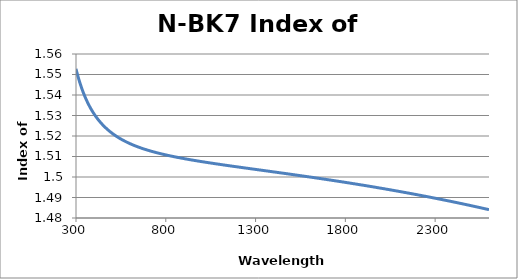
| Category | N-BK7 Index of Refraction |
|---|---|
| 300.0 | 1.553 |
| 301.0 | 1.552 |
| 302.0 | 1.552 |
| 303.0 | 1.552 |
| 304.0 | 1.551 |
| 305.0 | 1.551 |
| 306.0 | 1.551 |
| 307.0 | 1.55 |
| 308.0 | 1.55 |
| 309.0 | 1.55 |
| 310.0 | 1.549 |
| 311.0 | 1.549 |
| 312.0 | 1.549 |
| 313.0 | 1.548 |
| 314.0 | 1.548 |
| 315.0 | 1.548 |
| 316.0 | 1.548 |
| 317.0 | 1.547 |
| 318.0 | 1.547 |
| 319.0 | 1.547 |
| 320.0 | 1.546 |
| 321.0 | 1.546 |
| 322.0 | 1.546 |
| 323.0 | 1.546 |
| 324.0 | 1.545 |
| 325.0 | 1.545 |
| 326.0 | 1.545 |
| 327.0 | 1.545 |
| 328.0 | 1.544 |
| 329.0 | 1.544 |
| 330.0 | 1.544 |
| 331.0 | 1.543 |
| 332.0 | 1.543 |
| 333.0 | 1.543 |
| 334.0 | 1.543 |
| 335.0 | 1.543 |
| 336.0 | 1.542 |
| 337.0 | 1.542 |
| 338.0 | 1.542 |
| 339.0 | 1.542 |
| 340.0 | 1.541 |
| 341.0 | 1.541 |
| 342.0 | 1.541 |
| 343.0 | 1.541 |
| 344.0 | 1.54 |
| 345.0 | 1.54 |
| 346.0 | 1.54 |
| 347.0 | 1.54 |
| 348.0 | 1.54 |
| 349.0 | 1.539 |
| 350.0 | 1.539 |
| 351.0 | 1.539 |
| 352.0 | 1.539 |
| 353.0 | 1.539 |
| 354.0 | 1.538 |
| 355.0 | 1.538 |
| 356.0 | 1.538 |
| 357.0 | 1.538 |
| 358.0 | 1.538 |
| 359.0 | 1.537 |
| 360.0 | 1.537 |
| 361.0 | 1.537 |
| 362.0 | 1.537 |
| 363.0 | 1.537 |
| 364.0 | 1.536 |
| 365.0 | 1.536 |
| 366.0 | 1.536 |
| 367.0 | 1.536 |
| 368.0 | 1.536 |
| 369.0 | 1.536 |
| 370.0 | 1.535 |
| 371.0 | 1.535 |
| 372.0 | 1.535 |
| 373.0 | 1.535 |
| 374.0 | 1.535 |
| 375.0 | 1.535 |
| 376.0 | 1.534 |
| 377.0 | 1.534 |
| 378.0 | 1.534 |
| 379.0 | 1.534 |
| 380.0 | 1.534 |
| 381.0 | 1.534 |
| 382.0 | 1.533 |
| 383.0 | 1.533 |
| 384.0 | 1.533 |
| 385.0 | 1.533 |
| 386.0 | 1.533 |
| 387.0 | 1.533 |
| 388.0 | 1.533 |
| 389.0 | 1.532 |
| 390.0 | 1.532 |
| 391.0 | 1.532 |
| 392.0 | 1.532 |
| 393.0 | 1.532 |
| 394.0 | 1.532 |
| 395.0 | 1.532 |
| 396.0 | 1.531 |
| 397.0 | 1.531 |
| 398.0 | 1.531 |
| 399.0 | 1.531 |
| 400.0 | 1.531 |
| 401.0 | 1.531 |
| 402.0 | 1.531 |
| 403.0 | 1.53 |
| 404.0 | 1.53 |
| 405.0 | 1.53 |
| 406.0 | 1.53 |
| 407.0 | 1.53 |
| 408.0 | 1.53 |
| 409.0 | 1.53 |
| 410.0 | 1.53 |
| 411.0 | 1.529 |
| 412.0 | 1.529 |
| 413.0 | 1.529 |
| 414.0 | 1.529 |
| 415.0 | 1.529 |
| 416.0 | 1.529 |
| 417.0 | 1.529 |
| 418.0 | 1.529 |
| 419.0 | 1.528 |
| 420.0 | 1.528 |
| 421.0 | 1.528 |
| 422.0 | 1.528 |
| 423.0 | 1.528 |
| 424.0 | 1.528 |
| 425.0 | 1.528 |
| 426.0 | 1.528 |
| 427.0 | 1.528 |
| 428.0 | 1.528 |
| 429.0 | 1.527 |
| 430.0 | 1.527 |
| 431.0 | 1.527 |
| 432.0 | 1.527 |
| 433.0 | 1.527 |
| 434.0 | 1.527 |
| 435.0 | 1.527 |
| 436.0 | 1.527 |
| 437.0 | 1.527 |
| 438.0 | 1.526 |
| 439.0 | 1.526 |
| 440.0 | 1.526 |
| 441.0 | 1.526 |
| 442.0 | 1.526 |
| 443.0 | 1.526 |
| 444.0 | 1.526 |
| 445.0 | 1.526 |
| 446.0 | 1.526 |
| 447.0 | 1.526 |
| 448.0 | 1.526 |
| 449.0 | 1.525 |
| 450.0 | 1.525 |
| 451.0 | 1.525 |
| 452.0 | 1.525 |
| 453.0 | 1.525 |
| 454.0 | 1.525 |
| 455.0 | 1.525 |
| 456.0 | 1.525 |
| 457.0 | 1.525 |
| 458.0 | 1.525 |
| 459.0 | 1.525 |
| 460.0 | 1.524 |
| 461.0 | 1.524 |
| 462.0 | 1.524 |
| 463.0 | 1.524 |
| 464.0 | 1.524 |
| 465.0 | 1.524 |
| 466.0 | 1.524 |
| 467.0 | 1.524 |
| 468.0 | 1.524 |
| 469.0 | 1.524 |
| 470.0 | 1.524 |
| 471.0 | 1.524 |
| 472.0 | 1.523 |
| 473.0 | 1.523 |
| 474.0 | 1.523 |
| 475.0 | 1.523 |
| 476.0 | 1.523 |
| 477.0 | 1.523 |
| 478.0 | 1.523 |
| 479.0 | 1.523 |
| 480.0 | 1.523 |
| 481.0 | 1.523 |
| 482.0 | 1.523 |
| 483.0 | 1.523 |
| 484.0 | 1.523 |
| 485.0 | 1.522 |
| 486.0 | 1.522 |
| 487.0 | 1.522 |
| 488.0 | 1.522 |
| 489.0 | 1.522 |
| 490.0 | 1.522 |
| 491.0 | 1.522 |
| 492.0 | 1.522 |
| 493.0 | 1.522 |
| 494.0 | 1.522 |
| 495.0 | 1.522 |
| 496.0 | 1.522 |
| 497.0 | 1.522 |
| 498.0 | 1.522 |
| 499.0 | 1.521 |
| 500.0 | 1.521 |
| 501.0 | 1.521 |
| 502.0 | 1.521 |
| 503.0 | 1.521 |
| 504.0 | 1.521 |
| 505.0 | 1.521 |
| 506.0 | 1.521 |
| 507.0 | 1.521 |
| 508.0 | 1.521 |
| 509.0 | 1.521 |
| 510.0 | 1.521 |
| 511.0 | 1.521 |
| 512.0 | 1.521 |
| 513.0 | 1.521 |
| 514.0 | 1.521 |
| 515.0 | 1.52 |
| 516.0 | 1.52 |
| 517.0 | 1.52 |
| 518.0 | 1.52 |
| 519.0 | 1.52 |
| 520.0 | 1.52 |
| 521.0 | 1.52 |
| 522.0 | 1.52 |
| 523.0 | 1.52 |
| 524.0 | 1.52 |
| 525.0 | 1.52 |
| 526.0 | 1.52 |
| 527.0 | 1.52 |
| 528.0 | 1.52 |
| 529.0 | 1.52 |
| 530.0 | 1.52 |
| 531.0 | 1.52 |
| 532.0 | 1.519 |
| 533.0 | 1.519 |
| 534.0 | 1.519 |
| 535.0 | 1.519 |
| 536.0 | 1.519 |
| 537.0 | 1.519 |
| 538.0 | 1.519 |
| 539.0 | 1.519 |
| 540.0 | 1.519 |
| 541.0 | 1.519 |
| 542.0 | 1.519 |
| 543.0 | 1.519 |
| 544.0 | 1.519 |
| 545.0 | 1.519 |
| 546.0 | 1.519 |
| 547.0 | 1.519 |
| 548.0 | 1.519 |
| 549.0 | 1.519 |
| 550.0 | 1.519 |
| 551.0 | 1.518 |
| 552.0 | 1.518 |
| 553.0 | 1.518 |
| 554.0 | 1.518 |
| 555.0 | 1.518 |
| 556.0 | 1.518 |
| 557.0 | 1.518 |
| 558.0 | 1.518 |
| 559.0 | 1.518 |
| 560.0 | 1.518 |
| 561.0 | 1.518 |
| 562.0 | 1.518 |
| 563.0 | 1.518 |
| 564.0 | 1.518 |
| 565.0 | 1.518 |
| 566.0 | 1.518 |
| 567.0 | 1.518 |
| 568.0 | 1.518 |
| 569.0 | 1.518 |
| 570.0 | 1.518 |
| 571.0 | 1.518 |
| 572.0 | 1.517 |
| 573.0 | 1.517 |
| 574.0 | 1.517 |
| 575.0 | 1.517 |
| 576.0 | 1.517 |
| 577.0 | 1.517 |
| 578.0 | 1.517 |
| 579.0 | 1.517 |
| 580.0 | 1.517 |
| 581.0 | 1.517 |
| 582.0 | 1.517 |
| 583.0 | 1.517 |
| 584.0 | 1.517 |
| 585.0 | 1.517 |
| 586.0 | 1.517 |
| 587.0 | 1.517 |
| 588.0 | 1.517 |
| 589.0 | 1.517 |
| 590.0 | 1.517 |
| 591.0 | 1.517 |
| 592.0 | 1.517 |
| 593.0 | 1.517 |
| 594.0 | 1.517 |
| 595.0 | 1.516 |
| 596.0 | 1.516 |
| 597.0 | 1.516 |
| 598.0 | 1.516 |
| 599.0 | 1.516 |
| 600.0 | 1.516 |
| 601.0 | 1.516 |
| 602.0 | 1.516 |
| 603.0 | 1.516 |
| 604.0 | 1.516 |
| 605.0 | 1.516 |
| 606.0 | 1.516 |
| 607.0 | 1.516 |
| 608.0 | 1.516 |
| 609.0 | 1.516 |
| 610.0 | 1.516 |
| 611.0 | 1.516 |
| 612.0 | 1.516 |
| 613.0 | 1.516 |
| 614.0 | 1.516 |
| 615.0 | 1.516 |
| 616.0 | 1.516 |
| 617.0 | 1.516 |
| 618.0 | 1.516 |
| 619.0 | 1.516 |
| 620.0 | 1.516 |
| 621.0 | 1.516 |
| 622.0 | 1.515 |
| 623.0 | 1.515 |
| 624.0 | 1.515 |
| 625.0 | 1.515 |
| 626.0 | 1.515 |
| 627.0 | 1.515 |
| 628.0 | 1.515 |
| 629.0 | 1.515 |
| 630.0 | 1.515 |
| 631.0 | 1.515 |
| 632.0 | 1.515 |
| 633.0 | 1.515 |
| 634.0 | 1.515 |
| 635.0 | 1.515 |
| 636.0 | 1.515 |
| 637.0 | 1.515 |
| 638.0 | 1.515 |
| 639.0 | 1.515 |
| 640.0 | 1.515 |
| 641.0 | 1.515 |
| 642.0 | 1.515 |
| 643.0 | 1.515 |
| 644.0 | 1.515 |
| 645.0 | 1.515 |
| 646.0 | 1.515 |
| 647.0 | 1.515 |
| 648.0 | 1.515 |
| 649.0 | 1.515 |
| 650.0 | 1.515 |
| 651.0 | 1.514 |
| 652.0 | 1.514 |
| 653.0 | 1.514 |
| 654.0 | 1.514 |
| 655.0 | 1.514 |
| 656.0 | 1.514 |
| 657.0 | 1.514 |
| 658.0 | 1.514 |
| 659.0 | 1.514 |
| 660.0 | 1.514 |
| 661.0 | 1.514 |
| 662.0 | 1.514 |
| 663.0 | 1.514 |
| 664.0 | 1.514 |
| 665.0 | 1.514 |
| 666.0 | 1.514 |
| 667.0 | 1.514 |
| 668.0 | 1.514 |
| 669.0 | 1.514 |
| 670.0 | 1.514 |
| 671.0 | 1.514 |
| 672.0 | 1.514 |
| 673.0 | 1.514 |
| 674.0 | 1.514 |
| 675.0 | 1.514 |
| 676.0 | 1.514 |
| 677.0 | 1.514 |
| 678.0 | 1.514 |
| 679.0 | 1.514 |
| 680.0 | 1.514 |
| 681.0 | 1.514 |
| 682.0 | 1.514 |
| 683.0 | 1.514 |
| 684.0 | 1.514 |
| 685.0 | 1.513 |
| 686.0 | 1.513 |
| 687.0 | 1.513 |
| 688.0 | 1.513 |
| 689.0 | 1.513 |
| 690.0 | 1.513 |
| 691.0 | 1.513 |
| 692.0 | 1.513 |
| 693.0 | 1.513 |
| 694.0 | 1.513 |
| 695.0 | 1.513 |
| 696.0 | 1.513 |
| 697.0 | 1.513 |
| 698.0 | 1.513 |
| 699.0 | 1.513 |
| 700.0 | 1.513 |
| 701.0 | 1.513 |
| 702.0 | 1.513 |
| 703.0 | 1.513 |
| 704.0 | 1.513 |
| 705.0 | 1.513 |
| 706.0 | 1.513 |
| 707.0 | 1.513 |
| 708.0 | 1.513 |
| 709.0 | 1.513 |
| 710.0 | 1.513 |
| 711.0 | 1.513 |
| 712.0 | 1.513 |
| 713.0 | 1.513 |
| 714.0 | 1.513 |
| 715.0 | 1.513 |
| 716.0 | 1.513 |
| 717.0 | 1.513 |
| 718.0 | 1.513 |
| 719.0 | 1.513 |
| 720.0 | 1.513 |
| 721.0 | 1.513 |
| 722.0 | 1.512 |
| 723.0 | 1.512 |
| 724.0 | 1.512 |
| 725.0 | 1.512 |
| 726.0 | 1.512 |
| 727.0 | 1.512 |
| 728.0 | 1.512 |
| 729.0 | 1.512 |
| 730.0 | 1.512 |
| 731.0 | 1.512 |
| 732.0 | 1.512 |
| 733.0 | 1.512 |
| 734.0 | 1.512 |
| 735.0 | 1.512 |
| 736.0 | 1.512 |
| 737.0 | 1.512 |
| 738.0 | 1.512 |
| 739.0 | 1.512 |
| 740.0 | 1.512 |
| 741.0 | 1.512 |
| 742.0 | 1.512 |
| 743.0 | 1.512 |
| 744.0 | 1.512 |
| 745.0 | 1.512 |
| 746.0 | 1.512 |
| 747.0 | 1.512 |
| 748.0 | 1.512 |
| 749.0 | 1.512 |
| 750.0 | 1.512 |
| 751.0 | 1.512 |
| 752.0 | 1.512 |
| 753.0 | 1.512 |
| 754.0 | 1.512 |
| 755.0 | 1.512 |
| 756.0 | 1.512 |
| 757.0 | 1.512 |
| 758.0 | 1.512 |
| 759.0 | 1.512 |
| 760.0 | 1.512 |
| 761.0 | 1.512 |
| 762.0 | 1.512 |
| 763.0 | 1.512 |
| 764.0 | 1.512 |
| 765.0 | 1.512 |
| 766.0 | 1.511 |
| 767.0 | 1.511 |
| 768.0 | 1.511 |
| 769.0 | 1.511 |
| 770.0 | 1.511 |
| 771.0 | 1.511 |
| 772.0 | 1.511 |
| 773.0 | 1.511 |
| 774.0 | 1.511 |
| 775.0 | 1.511 |
| 776.0 | 1.511 |
| 777.0 | 1.511 |
| 778.0 | 1.511 |
| 779.0 | 1.511 |
| 780.0 | 1.511 |
| 781.0 | 1.511 |
| 782.0 | 1.511 |
| 783.0 | 1.511 |
| 784.0 | 1.511 |
| 785.0 | 1.511 |
| 786.0 | 1.511 |
| 787.0 | 1.511 |
| 788.0 | 1.511 |
| 789.0 | 1.511 |
| 790.0 | 1.511 |
| 791.0 | 1.511 |
| 792.0 | 1.511 |
| 793.0 | 1.511 |
| 794.0 | 1.511 |
| 795.0 | 1.511 |
| 796.0 | 1.511 |
| 797.0 | 1.511 |
| 798.0 | 1.511 |
| 799.0 | 1.511 |
| 800.0 | 1.511 |
| 801.0 | 1.511 |
| 802.0 | 1.511 |
| 803.0 | 1.511 |
| 804.0 | 1.511 |
| 805.0 | 1.511 |
| 806.0 | 1.511 |
| 807.0 | 1.511 |
| 808.0 | 1.511 |
| 809.0 | 1.511 |
| 810.0 | 1.511 |
| 811.0 | 1.511 |
| 812.0 | 1.511 |
| 813.0 | 1.511 |
| 814.0 | 1.511 |
| 815.0 | 1.51 |
| 816.0 | 1.51 |
| 817.0 | 1.51 |
| 818.0 | 1.51 |
| 819.0 | 1.51 |
| 820.0 | 1.51 |
| 821.0 | 1.51 |
| 822.0 | 1.51 |
| 823.0 | 1.51 |
| 824.0 | 1.51 |
| 825.0 | 1.51 |
| 826.0 | 1.51 |
| 827.0 | 1.51 |
| 828.0 | 1.51 |
| 829.0 | 1.51 |
| 830.0 | 1.51 |
| 831.0 | 1.51 |
| 832.0 | 1.51 |
| 833.0 | 1.51 |
| 834.0 | 1.51 |
| 835.0 | 1.51 |
| 836.0 | 1.51 |
| 837.0 | 1.51 |
| 838.0 | 1.51 |
| 839.0 | 1.51 |
| 840.0 | 1.51 |
| 841.0 | 1.51 |
| 842.0 | 1.51 |
| 843.0 | 1.51 |
| 844.0 | 1.51 |
| 845.0 | 1.51 |
| 846.0 | 1.51 |
| 847.0 | 1.51 |
| 848.0 | 1.51 |
| 849.0 | 1.51 |
| 850.0 | 1.51 |
| 851.0 | 1.51 |
| 852.0 | 1.51 |
| 853.0 | 1.51 |
| 854.0 | 1.51 |
| 855.0 | 1.51 |
| 856.0 | 1.51 |
| 857.0 | 1.51 |
| 858.0 | 1.51 |
| 859.0 | 1.51 |
| 860.0 | 1.51 |
| 861.0 | 1.51 |
| 862.0 | 1.51 |
| 863.0 | 1.51 |
| 864.0 | 1.51 |
| 865.0 | 1.51 |
| 866.0 | 1.51 |
| 867.0 | 1.51 |
| 868.0 | 1.51 |
| 869.0 | 1.51 |
| 870.0 | 1.509 |
| 871.0 | 1.509 |
| 872.0 | 1.509 |
| 873.0 | 1.509 |
| 874.0 | 1.509 |
| 875.0 | 1.509 |
| 876.0 | 1.509 |
| 877.0 | 1.509 |
| 878.0 | 1.509 |
| 879.0 | 1.509 |
| 880.0 | 1.509 |
| 881.0 | 1.509 |
| 882.0 | 1.509 |
| 883.0 | 1.509 |
| 884.0 | 1.509 |
| 885.0 | 1.509 |
| 886.0 | 1.509 |
| 887.0 | 1.509 |
| 888.0 | 1.509 |
| 889.0 | 1.509 |
| 890.0 | 1.509 |
| 891.0 | 1.509 |
| 892.0 | 1.509 |
| 893.0 | 1.509 |
| 894.0 | 1.509 |
| 895.0 | 1.509 |
| 896.0 | 1.509 |
| 897.0 | 1.509 |
| 898.0 | 1.509 |
| 899.0 | 1.509 |
| 900.0 | 1.509 |
| 901.0 | 1.509 |
| 902.0 | 1.509 |
| 903.0 | 1.509 |
| 904.0 | 1.509 |
| 905.0 | 1.509 |
| 906.0 | 1.509 |
| 907.0 | 1.509 |
| 908.0 | 1.509 |
| 909.0 | 1.509 |
| 910.0 | 1.509 |
| 911.0 | 1.509 |
| 912.0 | 1.509 |
| 913.0 | 1.509 |
| 914.0 | 1.509 |
| 915.0 | 1.509 |
| 916.0 | 1.509 |
| 917.0 | 1.509 |
| 918.0 | 1.509 |
| 919.0 | 1.509 |
| 920.0 | 1.509 |
| 921.0 | 1.509 |
| 922.0 | 1.509 |
| 923.0 | 1.509 |
| 924.0 | 1.509 |
| 925.0 | 1.509 |
| 926.0 | 1.509 |
| 927.0 | 1.509 |
| 928.0 | 1.509 |
| 929.0 | 1.509 |
| 930.0 | 1.509 |
| 931.0 | 1.509 |
| 932.0 | 1.508 |
| 933.0 | 1.508 |
| 934.0 | 1.508 |
| 935.0 | 1.508 |
| 936.0 | 1.508 |
| 937.0 | 1.508 |
| 938.0 | 1.508 |
| 939.0 | 1.508 |
| 940.0 | 1.508 |
| 941.0 | 1.508 |
| 942.0 | 1.508 |
| 943.0 | 1.508 |
| 944.0 | 1.508 |
| 945.0 | 1.508 |
| 946.0 | 1.508 |
| 947.0 | 1.508 |
| 948.0 | 1.508 |
| 949.0 | 1.508 |
| 950.0 | 1.508 |
| 951.0 | 1.508 |
| 952.0 | 1.508 |
| 953.0 | 1.508 |
| 954.0 | 1.508 |
| 955.0 | 1.508 |
| 956.0 | 1.508 |
| 957.0 | 1.508 |
| 958.0 | 1.508 |
| 959.0 | 1.508 |
| 960.0 | 1.508 |
| 961.0 | 1.508 |
| 962.0 | 1.508 |
| 963.0 | 1.508 |
| 964.0 | 1.508 |
| 965.0 | 1.508 |
| 966.0 | 1.508 |
| 967.0 | 1.508 |
| 968.0 | 1.508 |
| 969.0 | 1.508 |
| 970.0 | 1.508 |
| 971.0 | 1.508 |
| 972.0 | 1.508 |
| 973.0 | 1.508 |
| 974.0 | 1.508 |
| 975.0 | 1.508 |
| 976.0 | 1.508 |
| 977.0 | 1.508 |
| 978.0 | 1.508 |
| 979.0 | 1.508 |
| 980.0 | 1.508 |
| 981.0 | 1.508 |
| 982.0 | 1.508 |
| 983.0 | 1.508 |
| 984.0 | 1.508 |
| 985.0 | 1.508 |
| 986.0 | 1.508 |
| 987.0 | 1.508 |
| 988.0 | 1.508 |
| 989.0 | 1.508 |
| 990.0 | 1.508 |
| 991.0 | 1.508 |
| 992.0 | 1.508 |
| 993.0 | 1.508 |
| 994.0 | 1.508 |
| 995.0 | 1.508 |
| 996.0 | 1.508 |
| 997.0 | 1.508 |
| 998.0 | 1.508 |
| 999.0 | 1.508 |
| 1000.0 | 1.508 |
| 1001.0 | 1.507 |
| 1002.0 | 1.507 |
| 1003.0 | 1.507 |
| 1004.0 | 1.507 |
| 1005.0 | 1.507 |
| 1006.0 | 1.507 |
| 1007.0 | 1.507 |
| 1008.0 | 1.507 |
| 1009.0 | 1.507 |
| 1010.0 | 1.507 |
| 1011.0 | 1.507 |
| 1012.0 | 1.507 |
| 1013.0 | 1.507 |
| 1014.0 | 1.507 |
| 1015.0 | 1.507 |
| 1016.0 | 1.507 |
| 1017.0 | 1.507 |
| 1018.0 | 1.507 |
| 1019.0 | 1.507 |
| 1020.0 | 1.507 |
| 1021.0 | 1.507 |
| 1022.0 | 1.507 |
| 1023.0 | 1.507 |
| 1024.0 | 1.507 |
| 1025.0 | 1.507 |
| 1026.0 | 1.507 |
| 1027.0 | 1.507 |
| 1028.0 | 1.507 |
| 1029.0 | 1.507 |
| 1030.0 | 1.507 |
| 1031.0 | 1.507 |
| 1032.0 | 1.507 |
| 1033.0 | 1.507 |
| 1034.0 | 1.507 |
| 1035.0 | 1.507 |
| 1036.0 | 1.507 |
| 1037.0 | 1.507 |
| 1038.0 | 1.507 |
| 1039.0 | 1.507 |
| 1040.0 | 1.507 |
| 1041.0 | 1.507 |
| 1042.0 | 1.507 |
| 1043.0 | 1.507 |
| 1044.0 | 1.507 |
| 1045.0 | 1.507 |
| 1046.0 | 1.507 |
| 1047.0 | 1.507 |
| 1048.0 | 1.507 |
| 1049.0 | 1.507 |
| 1050.0 | 1.507 |
| 1051.0 | 1.507 |
| 1052.0 | 1.507 |
| 1053.0 | 1.507 |
| 1054.0 | 1.507 |
| 1055.0 | 1.507 |
| 1056.0 | 1.507 |
| 1057.0 | 1.507 |
| 1058.0 | 1.507 |
| 1059.0 | 1.507 |
| 1060.0 | 1.507 |
| 1061.0 | 1.507 |
| 1062.0 | 1.507 |
| 1063.0 | 1.507 |
| 1064.0 | 1.507 |
| 1065.0 | 1.507 |
| 1066.0 | 1.507 |
| 1067.0 | 1.507 |
| 1068.0 | 1.507 |
| 1069.0 | 1.507 |
| 1070.0 | 1.507 |
| 1071.0 | 1.507 |
| 1072.0 | 1.507 |
| 1073.0 | 1.507 |
| 1074.0 | 1.507 |
| 1075.0 | 1.506 |
| 1076.0 | 1.506 |
| 1077.0 | 1.506 |
| 1078.0 | 1.506 |
| 1079.0 | 1.506 |
| 1080.0 | 1.506 |
| 1081.0 | 1.506 |
| 1082.0 | 1.506 |
| 1083.0 | 1.506 |
| 1084.0 | 1.506 |
| 1085.0 | 1.506 |
| 1086.0 | 1.506 |
| 1087.0 | 1.506 |
| 1088.0 | 1.506 |
| 1089.0 | 1.506 |
| 1090.0 | 1.506 |
| 1091.0 | 1.506 |
| 1092.0 | 1.506 |
| 1093.0 | 1.506 |
| 1094.0 | 1.506 |
| 1095.0 | 1.506 |
| 1096.0 | 1.506 |
| 1097.0 | 1.506 |
| 1098.0 | 1.506 |
| 1099.0 | 1.506 |
| 1100.0 | 1.506 |
| 1101.0 | 1.506 |
| 1102.0 | 1.506 |
| 1103.0 | 1.506 |
| 1104.0 | 1.506 |
| 1105.0 | 1.506 |
| 1106.0 | 1.506 |
| 1107.0 | 1.506 |
| 1108.0 | 1.506 |
| 1109.0 | 1.506 |
| 1110.0 | 1.506 |
| 1111.0 | 1.506 |
| 1112.0 | 1.506 |
| 1113.0 | 1.506 |
| 1114.0 | 1.506 |
| 1115.0 | 1.506 |
| 1116.0 | 1.506 |
| 1117.0 | 1.506 |
| 1118.0 | 1.506 |
| 1119.0 | 1.506 |
| 1120.0 | 1.506 |
| 1121.0 | 1.506 |
| 1122.0 | 1.506 |
| 1123.0 | 1.506 |
| 1124.0 | 1.506 |
| 1125.0 | 1.506 |
| 1126.0 | 1.506 |
| 1127.0 | 1.506 |
| 1128.0 | 1.506 |
| 1129.0 | 1.506 |
| 1130.0 | 1.506 |
| 1131.0 | 1.506 |
| 1132.0 | 1.506 |
| 1133.0 | 1.506 |
| 1134.0 | 1.506 |
| 1135.0 | 1.506 |
| 1136.0 | 1.506 |
| 1137.0 | 1.506 |
| 1138.0 | 1.506 |
| 1139.0 | 1.506 |
| 1140.0 | 1.506 |
| 1141.0 | 1.506 |
| 1142.0 | 1.506 |
| 1143.0 | 1.506 |
| 1144.0 | 1.506 |
| 1145.0 | 1.506 |
| 1146.0 | 1.506 |
| 1147.0 | 1.506 |
| 1148.0 | 1.506 |
| 1149.0 | 1.506 |
| 1150.0 | 1.506 |
| 1151.0 | 1.506 |
| 1152.0 | 1.506 |
| 1153.0 | 1.505 |
| 1154.0 | 1.505 |
| 1155.0 | 1.505 |
| 1156.0 | 1.505 |
| 1157.0 | 1.505 |
| 1158.0 | 1.505 |
| 1159.0 | 1.505 |
| 1160.0 | 1.505 |
| 1161.0 | 1.505 |
| 1162.0 | 1.505 |
| 1163.0 | 1.505 |
| 1164.0 | 1.505 |
| 1165.0 | 1.505 |
| 1166.0 | 1.505 |
| 1167.0 | 1.505 |
| 1168.0 | 1.505 |
| 1169.0 | 1.505 |
| 1170.0 | 1.505 |
| 1171.0 | 1.505 |
| 1172.0 | 1.505 |
| 1173.0 | 1.505 |
| 1174.0 | 1.505 |
| 1175.0 | 1.505 |
| 1176.0 | 1.505 |
| 1177.0 | 1.505 |
| 1178.0 | 1.505 |
| 1179.0 | 1.505 |
| 1180.0 | 1.505 |
| 1181.0 | 1.505 |
| 1182.0 | 1.505 |
| 1183.0 | 1.505 |
| 1184.0 | 1.505 |
| 1185.0 | 1.505 |
| 1186.0 | 1.505 |
| 1187.0 | 1.505 |
| 1188.0 | 1.505 |
| 1189.0 | 1.505 |
| 1190.0 | 1.505 |
| 1191.0 | 1.505 |
| 1192.0 | 1.505 |
| 1193.0 | 1.505 |
| 1194.0 | 1.505 |
| 1195.0 | 1.505 |
| 1196.0 | 1.505 |
| 1197.0 | 1.505 |
| 1198.0 | 1.505 |
| 1199.0 | 1.505 |
| 1200.0 | 1.505 |
| 1201.0 | 1.505 |
| 1202.0 | 1.505 |
| 1203.0 | 1.505 |
| 1204.0 | 1.505 |
| 1205.0 | 1.505 |
| 1206.0 | 1.505 |
| 1207.0 | 1.505 |
| 1208.0 | 1.505 |
| 1209.0 | 1.505 |
| 1210.0 | 1.505 |
| 1211.0 | 1.505 |
| 1212.0 | 1.505 |
| 1213.0 | 1.505 |
| 1214.0 | 1.505 |
| 1215.0 | 1.505 |
| 1216.0 | 1.505 |
| 1217.0 | 1.505 |
| 1218.0 | 1.505 |
| 1219.0 | 1.505 |
| 1220.0 | 1.505 |
| 1221.0 | 1.505 |
| 1222.0 | 1.505 |
| 1223.0 | 1.505 |
| 1224.0 | 1.505 |
| 1225.0 | 1.505 |
| 1226.0 | 1.505 |
| 1227.0 | 1.505 |
| 1228.0 | 1.505 |
| 1229.0 | 1.505 |
| 1230.0 | 1.505 |
| 1231.0 | 1.505 |
| 1232.0 | 1.505 |
| 1233.0 | 1.505 |
| 1234.0 | 1.505 |
| 1235.0 | 1.504 |
| 1236.0 | 1.504 |
| 1237.0 | 1.504 |
| 1238.0 | 1.504 |
| 1239.0 | 1.504 |
| 1240.0 | 1.504 |
| 1241.0 | 1.504 |
| 1242.0 | 1.504 |
| 1243.0 | 1.504 |
| 1244.0 | 1.504 |
| 1245.0 | 1.504 |
| 1246.0 | 1.504 |
| 1247.0 | 1.504 |
| 1248.0 | 1.504 |
| 1249.0 | 1.504 |
| 1250.0 | 1.504 |
| 1251.0 | 1.504 |
| 1252.0 | 1.504 |
| 1253.0 | 1.504 |
| 1254.0 | 1.504 |
| 1255.0 | 1.504 |
| 1256.0 | 1.504 |
| 1257.0 | 1.504 |
| 1258.0 | 1.504 |
| 1259.0 | 1.504 |
| 1260.0 | 1.504 |
| 1261.0 | 1.504 |
| 1262.0 | 1.504 |
| 1263.0 | 1.504 |
| 1264.0 | 1.504 |
| 1265.0 | 1.504 |
| 1266.0 | 1.504 |
| 1267.0 | 1.504 |
| 1268.0 | 1.504 |
| 1269.0 | 1.504 |
| 1270.0 | 1.504 |
| 1271.0 | 1.504 |
| 1272.0 | 1.504 |
| 1273.0 | 1.504 |
| 1274.0 | 1.504 |
| 1275.0 | 1.504 |
| 1276.0 | 1.504 |
| 1277.0 | 1.504 |
| 1278.0 | 1.504 |
| 1279.0 | 1.504 |
| 1280.0 | 1.504 |
| 1281.0 | 1.504 |
| 1282.0 | 1.504 |
| 1283.0 | 1.504 |
| 1284.0 | 1.504 |
| 1285.0 | 1.504 |
| 1286.0 | 1.504 |
| 1287.0 | 1.504 |
| 1288.0 | 1.504 |
| 1289.0 | 1.504 |
| 1290.0 | 1.504 |
| 1291.0 | 1.504 |
| 1292.0 | 1.504 |
| 1293.0 | 1.504 |
| 1294.0 | 1.504 |
| 1295.0 | 1.504 |
| 1296.0 | 1.504 |
| 1297.0 | 1.504 |
| 1298.0 | 1.504 |
| 1299.0 | 1.504 |
| 1300.0 | 1.504 |
| 1301.0 | 1.504 |
| 1302.0 | 1.504 |
| 1303.0 | 1.504 |
| 1304.0 | 1.504 |
| 1305.0 | 1.504 |
| 1306.0 | 1.504 |
| 1307.0 | 1.504 |
| 1308.0 | 1.504 |
| 1309.0 | 1.504 |
| 1310.0 | 1.504 |
| 1311.0 | 1.504 |
| 1312.0 | 1.504 |
| 1313.0 | 1.504 |
| 1314.0 | 1.504 |
| 1315.0 | 1.504 |
| 1316.0 | 1.504 |
| 1317.0 | 1.503 |
| 1318.0 | 1.503 |
| 1319.0 | 1.503 |
| 1320.0 | 1.503 |
| 1321.0 | 1.503 |
| 1322.0 | 1.503 |
| 1323.0 | 1.503 |
| 1324.0 | 1.503 |
| 1325.0 | 1.503 |
| 1326.0 | 1.503 |
| 1327.0 | 1.503 |
| 1328.0 | 1.503 |
| 1329.0 | 1.503 |
| 1330.0 | 1.503 |
| 1331.0 | 1.503 |
| 1332.0 | 1.503 |
| 1333.0 | 1.503 |
| 1334.0 | 1.503 |
| 1335.0 | 1.503 |
| 1336.0 | 1.503 |
| 1337.0 | 1.503 |
| 1338.0 | 1.503 |
| 1339.0 | 1.503 |
| 1340.0 | 1.503 |
| 1341.0 | 1.503 |
| 1342.0 | 1.503 |
| 1343.0 | 1.503 |
| 1344.0 | 1.503 |
| 1345.0 | 1.503 |
| 1346.0 | 1.503 |
| 1347.0 | 1.503 |
| 1348.0 | 1.503 |
| 1349.0 | 1.503 |
| 1350.0 | 1.503 |
| 1351.0 | 1.503 |
| 1352.0 | 1.503 |
| 1353.0 | 1.503 |
| 1354.0 | 1.503 |
| 1355.0 | 1.503 |
| 1356.0 | 1.503 |
| 1357.0 | 1.503 |
| 1358.0 | 1.503 |
| 1359.0 | 1.503 |
| 1360.0 | 1.503 |
| 1361.0 | 1.503 |
| 1362.0 | 1.503 |
| 1363.0 | 1.503 |
| 1364.0 | 1.503 |
| 1365.0 | 1.503 |
| 1366.0 | 1.503 |
| 1367.0 | 1.503 |
| 1368.0 | 1.503 |
| 1369.0 | 1.503 |
| 1370.0 | 1.503 |
| 1371.0 | 1.503 |
| 1372.0 | 1.503 |
| 1373.0 | 1.503 |
| 1374.0 | 1.503 |
| 1375.0 | 1.503 |
| 1376.0 | 1.503 |
| 1377.0 | 1.503 |
| 1378.0 | 1.503 |
| 1379.0 | 1.503 |
| 1380.0 | 1.503 |
| 1381.0 | 1.503 |
| 1382.0 | 1.503 |
| 1383.0 | 1.503 |
| 1384.0 | 1.503 |
| 1385.0 | 1.503 |
| 1386.0 | 1.503 |
| 1387.0 | 1.503 |
| 1388.0 | 1.503 |
| 1389.0 | 1.503 |
| 1390.0 | 1.503 |
| 1391.0 | 1.503 |
| 1392.0 | 1.503 |
| 1393.0 | 1.503 |
| 1394.0 | 1.503 |
| 1395.0 | 1.503 |
| 1396.0 | 1.503 |
| 1397.0 | 1.503 |
| 1398.0 | 1.503 |
| 1399.0 | 1.503 |
| 1400.0 | 1.502 |
| 1401.0 | 1.502 |
| 1402.0 | 1.502 |
| 1403.0 | 1.502 |
| 1404.0 | 1.502 |
| 1405.0 | 1.502 |
| 1406.0 | 1.502 |
| 1407.0 | 1.502 |
| 1408.0 | 1.502 |
| 1409.0 | 1.502 |
| 1410.0 | 1.502 |
| 1411.0 | 1.502 |
| 1412.0 | 1.502 |
| 1413.0 | 1.502 |
| 1414.0 | 1.502 |
| 1415.0 | 1.502 |
| 1416.0 | 1.502 |
| 1417.0 | 1.502 |
| 1418.0 | 1.502 |
| 1419.0 | 1.502 |
| 1420.0 | 1.502 |
| 1421.0 | 1.502 |
| 1422.0 | 1.502 |
| 1423.0 | 1.502 |
| 1424.0 | 1.502 |
| 1425.0 | 1.502 |
| 1426.0 | 1.502 |
| 1427.0 | 1.502 |
| 1428.0 | 1.502 |
| 1429.0 | 1.502 |
| 1430.0 | 1.502 |
| 1431.0 | 1.502 |
| 1432.0 | 1.502 |
| 1433.0 | 1.502 |
| 1434.0 | 1.502 |
| 1435.0 | 1.502 |
| 1436.0 | 1.502 |
| 1437.0 | 1.502 |
| 1438.0 | 1.502 |
| 1439.0 | 1.502 |
| 1440.0 | 1.502 |
| 1441.0 | 1.502 |
| 1442.0 | 1.502 |
| 1443.0 | 1.502 |
| 1444.0 | 1.502 |
| 1445.0 | 1.502 |
| 1446.0 | 1.502 |
| 1447.0 | 1.502 |
| 1448.0 | 1.502 |
| 1449.0 | 1.502 |
| 1450.0 | 1.502 |
| 1451.0 | 1.502 |
| 1452.0 | 1.502 |
| 1453.0 | 1.502 |
| 1454.0 | 1.502 |
| 1455.0 | 1.502 |
| 1456.0 | 1.502 |
| 1457.0 | 1.502 |
| 1458.0 | 1.502 |
| 1459.0 | 1.502 |
| 1460.0 | 1.502 |
| 1461.0 | 1.502 |
| 1462.0 | 1.502 |
| 1463.0 | 1.502 |
| 1464.0 | 1.502 |
| 1465.0 | 1.502 |
| 1466.0 | 1.502 |
| 1467.0 | 1.502 |
| 1468.0 | 1.502 |
| 1469.0 | 1.502 |
| 1470.0 | 1.502 |
| 1471.0 | 1.502 |
| 1472.0 | 1.502 |
| 1473.0 | 1.502 |
| 1474.0 | 1.502 |
| 1475.0 | 1.502 |
| 1476.0 | 1.502 |
| 1477.0 | 1.502 |
| 1478.0 | 1.502 |
| 1479.0 | 1.502 |
| 1480.0 | 1.502 |
| 1481.0 | 1.502 |
| 1482.0 | 1.501 |
| 1483.0 | 1.501 |
| 1484.0 | 1.501 |
| 1485.0 | 1.501 |
| 1486.0 | 1.501 |
| 1487.0 | 1.501 |
| 1488.0 | 1.501 |
| 1489.0 | 1.501 |
| 1490.0 | 1.501 |
| 1491.0 | 1.501 |
| 1492.0 | 1.501 |
| 1493.0 | 1.501 |
| 1494.0 | 1.501 |
| 1495.0 | 1.501 |
| 1496.0 | 1.501 |
| 1497.0 | 1.501 |
| 1498.0 | 1.501 |
| 1499.0 | 1.501 |
| 1500.0 | 1.501 |
| 1501.0 | 1.501 |
| 1502.0 | 1.501 |
| 1503.0 | 1.501 |
| 1504.0 | 1.501 |
| 1505.0 | 1.501 |
| 1506.0 | 1.501 |
| 1507.0 | 1.501 |
| 1508.0 | 1.501 |
| 1509.0 | 1.501 |
| 1510.0 | 1.501 |
| 1511.0 | 1.501 |
| 1512.0 | 1.501 |
| 1513.0 | 1.501 |
| 1514.0 | 1.501 |
| 1515.0 | 1.501 |
| 1516.0 | 1.501 |
| 1517.0 | 1.501 |
| 1518.0 | 1.501 |
| 1519.0 | 1.501 |
| 1520.0 | 1.501 |
| 1521.0 | 1.501 |
| 1522.0 | 1.501 |
| 1523.0 | 1.501 |
| 1524.0 | 1.501 |
| 1525.0 | 1.501 |
| 1526.0 | 1.501 |
| 1527.0 | 1.501 |
| 1528.0 | 1.501 |
| 1529.0 | 1.501 |
| 1530.0 | 1.501 |
| 1531.0 | 1.501 |
| 1532.0 | 1.501 |
| 1533.0 | 1.501 |
| 1534.0 | 1.501 |
| 1535.0 | 1.501 |
| 1536.0 | 1.501 |
| 1537.0 | 1.501 |
| 1538.0 | 1.501 |
| 1539.0 | 1.501 |
| 1540.0 | 1.501 |
| 1541.0 | 1.501 |
| 1542.0 | 1.501 |
| 1543.0 | 1.501 |
| 1544.0 | 1.501 |
| 1545.0 | 1.501 |
| 1546.0 | 1.501 |
| 1547.0 | 1.501 |
| 1548.0 | 1.501 |
| 1549.0 | 1.501 |
| 1550.0 | 1.501 |
| 1551.0 | 1.501 |
| 1552.0 | 1.501 |
| 1553.0 | 1.501 |
| 1554.0 | 1.501 |
| 1555.0 | 1.501 |
| 1556.0 | 1.501 |
| 1557.0 | 1.501 |
| 1558.0 | 1.501 |
| 1559.0 | 1.501 |
| 1560.0 | 1.501 |
| 1561.0 | 1.501 |
| 1562.0 | 1.501 |
| 1563.0 | 1.5 |
| 1564.0 | 1.5 |
| 1565.0 | 1.5 |
| 1566.0 | 1.5 |
| 1567.0 | 1.5 |
| 1568.0 | 1.5 |
| 1569.0 | 1.5 |
| 1570.0 | 1.5 |
| 1571.0 | 1.5 |
| 1572.0 | 1.5 |
| 1573.0 | 1.5 |
| 1574.0 | 1.5 |
| 1575.0 | 1.5 |
| 1576.0 | 1.5 |
| 1577.0 | 1.5 |
| 1578.0 | 1.5 |
| 1579.0 | 1.5 |
| 1580.0 | 1.5 |
| 1581.0 | 1.5 |
| 1582.0 | 1.5 |
| 1583.0 | 1.5 |
| 1584.0 | 1.5 |
| 1585.0 | 1.5 |
| 1586.0 | 1.5 |
| 1587.0 | 1.5 |
| 1588.0 | 1.5 |
| 1589.0 | 1.5 |
| 1590.0 | 1.5 |
| 1591.0 | 1.5 |
| 1592.0 | 1.5 |
| 1593.0 | 1.5 |
| 1594.0 | 1.5 |
| 1595.0 | 1.5 |
| 1596.0 | 1.5 |
| 1597.0 | 1.5 |
| 1598.0 | 1.5 |
| 1599.0 | 1.5 |
| 1600.0 | 1.5 |
| 1601.0 | 1.5 |
| 1602.0 | 1.5 |
| 1603.0 | 1.5 |
| 1604.0 | 1.5 |
| 1605.0 | 1.5 |
| 1606.0 | 1.5 |
| 1607.0 | 1.5 |
| 1608.0 | 1.5 |
| 1609.0 | 1.5 |
| 1610.0 | 1.5 |
| 1611.0 | 1.5 |
| 1612.0 | 1.5 |
| 1613.0 | 1.5 |
| 1614.0 | 1.5 |
| 1615.0 | 1.5 |
| 1616.0 | 1.5 |
| 1617.0 | 1.5 |
| 1618.0 | 1.5 |
| 1619.0 | 1.5 |
| 1620.0 | 1.5 |
| 1621.0 | 1.5 |
| 1622.0 | 1.5 |
| 1623.0 | 1.5 |
| 1624.0 | 1.5 |
| 1625.0 | 1.5 |
| 1626.0 | 1.5 |
| 1627.0 | 1.5 |
| 1628.0 | 1.5 |
| 1629.0 | 1.5 |
| 1630.0 | 1.5 |
| 1631.0 | 1.5 |
| 1632.0 | 1.5 |
| 1633.0 | 1.5 |
| 1634.0 | 1.5 |
| 1635.0 | 1.5 |
| 1636.0 | 1.5 |
| 1637.0 | 1.5 |
| 1638.0 | 1.5 |
| 1639.0 | 1.5 |
| 1640.0 | 1.5 |
| 1641.0 | 1.499 |
| 1642.0 | 1.499 |
| 1643.0 | 1.499 |
| 1644.0 | 1.499 |
| 1645.0 | 1.499 |
| 1646.0 | 1.499 |
| 1647.0 | 1.499 |
| 1648.0 | 1.499 |
| 1649.0 | 1.499 |
| 1650.0 | 1.499 |
| 1651.0 | 1.499 |
| 1652.0 | 1.499 |
| 1653.0 | 1.499 |
| 1654.0 | 1.499 |
| 1655.0 | 1.499 |
| 1656.0 | 1.499 |
| 1657.0 | 1.499 |
| 1658.0 | 1.499 |
| 1659.0 | 1.499 |
| 1660.0 | 1.499 |
| 1661.0 | 1.499 |
| 1662.0 | 1.499 |
| 1663.0 | 1.499 |
| 1664.0 | 1.499 |
| 1665.0 | 1.499 |
| 1666.0 | 1.499 |
| 1667.0 | 1.499 |
| 1668.0 | 1.499 |
| 1669.0 | 1.499 |
| 1670.0 | 1.499 |
| 1671.0 | 1.499 |
| 1672.0 | 1.499 |
| 1673.0 | 1.499 |
| 1674.0 | 1.499 |
| 1675.0 | 1.499 |
| 1676.0 | 1.499 |
| 1677.0 | 1.499 |
| 1678.0 | 1.499 |
| 1679.0 | 1.499 |
| 1680.0 | 1.499 |
| 1681.0 | 1.499 |
| 1682.0 | 1.499 |
| 1683.0 | 1.499 |
| 1684.0 | 1.499 |
| 1685.0 | 1.499 |
| 1686.0 | 1.499 |
| 1687.0 | 1.499 |
| 1688.0 | 1.499 |
| 1689.0 | 1.499 |
| 1690.0 | 1.499 |
| 1691.0 | 1.499 |
| 1692.0 | 1.499 |
| 1693.0 | 1.499 |
| 1694.0 | 1.499 |
| 1695.0 | 1.499 |
| 1696.0 | 1.499 |
| 1697.0 | 1.499 |
| 1698.0 | 1.499 |
| 1699.0 | 1.499 |
| 1700.0 | 1.499 |
| 1701.0 | 1.499 |
| 1702.0 | 1.499 |
| 1703.0 | 1.499 |
| 1704.0 | 1.499 |
| 1705.0 | 1.499 |
| 1706.0 | 1.499 |
| 1707.0 | 1.499 |
| 1708.0 | 1.499 |
| 1709.0 | 1.499 |
| 1710.0 | 1.499 |
| 1711.0 | 1.499 |
| 1712.0 | 1.499 |
| 1713.0 | 1.499 |
| 1714.0 | 1.499 |
| 1715.0 | 1.499 |
| 1716.0 | 1.499 |
| 1717.0 | 1.498 |
| 1718.0 | 1.498 |
| 1719.0 | 1.498 |
| 1720.0 | 1.498 |
| 1721.0 | 1.498 |
| 1722.0 | 1.498 |
| 1723.0 | 1.498 |
| 1724.0 | 1.498 |
| 1725.0 | 1.498 |
| 1726.0 | 1.498 |
| 1727.0 | 1.498 |
| 1728.0 | 1.498 |
| 1729.0 | 1.498 |
| 1730.0 | 1.498 |
| 1731.0 | 1.498 |
| 1732.0 | 1.498 |
| 1733.0 | 1.498 |
| 1734.0 | 1.498 |
| 1735.0 | 1.498 |
| 1736.0 | 1.498 |
| 1737.0 | 1.498 |
| 1738.0 | 1.498 |
| 1739.0 | 1.498 |
| 1740.0 | 1.498 |
| 1741.0 | 1.498 |
| 1742.0 | 1.498 |
| 1743.0 | 1.498 |
| 1744.0 | 1.498 |
| 1745.0 | 1.498 |
| 1746.0 | 1.498 |
| 1747.0 | 1.498 |
| 1748.0 | 1.498 |
| 1749.0 | 1.498 |
| 1750.0 | 1.498 |
| 1751.0 | 1.498 |
| 1752.0 | 1.498 |
| 1753.0 | 1.498 |
| 1754.0 | 1.498 |
| 1755.0 | 1.498 |
| 1756.0 | 1.498 |
| 1757.0 | 1.498 |
| 1758.0 | 1.498 |
| 1759.0 | 1.498 |
| 1760.0 | 1.498 |
| 1761.0 | 1.498 |
| 1762.0 | 1.498 |
| 1763.0 | 1.498 |
| 1764.0 | 1.498 |
| 1765.0 | 1.498 |
| 1766.0 | 1.498 |
| 1767.0 | 1.498 |
| 1768.0 | 1.498 |
| 1769.0 | 1.498 |
| 1770.0 | 1.498 |
| 1771.0 | 1.498 |
| 1772.0 | 1.498 |
| 1773.0 | 1.498 |
| 1774.0 | 1.498 |
| 1775.0 | 1.498 |
| 1776.0 | 1.498 |
| 1777.0 | 1.498 |
| 1778.0 | 1.498 |
| 1779.0 | 1.498 |
| 1780.0 | 1.498 |
| 1781.0 | 1.498 |
| 1782.0 | 1.498 |
| 1783.0 | 1.498 |
| 1784.0 | 1.498 |
| 1785.0 | 1.498 |
| 1786.0 | 1.498 |
| 1787.0 | 1.498 |
| 1788.0 | 1.498 |
| 1789.0 | 1.498 |
| 1790.0 | 1.498 |
| 1791.0 | 1.498 |
| 1792.0 | 1.497 |
| 1793.0 | 1.497 |
| 1794.0 | 1.497 |
| 1795.0 | 1.497 |
| 1796.0 | 1.497 |
| 1797.0 | 1.497 |
| 1798.0 | 1.497 |
| 1799.0 | 1.497 |
| 1800.0 | 1.497 |
| 1801.0 | 1.497 |
| 1802.0 | 1.497 |
| 1803.0 | 1.497 |
| 1804.0 | 1.497 |
| 1805.0 | 1.497 |
| 1806.0 | 1.497 |
| 1807.0 | 1.497 |
| 1808.0 | 1.497 |
| 1809.0 | 1.497 |
| 1810.0 | 1.497 |
| 1811.0 | 1.497 |
| 1812.0 | 1.497 |
| 1813.0 | 1.497 |
| 1814.0 | 1.497 |
| 1815.0 | 1.497 |
| 1816.0 | 1.497 |
| 1817.0 | 1.497 |
| 1818.0 | 1.497 |
| 1819.0 | 1.497 |
| 1820.0 | 1.497 |
| 1821.0 | 1.497 |
| 1822.0 | 1.497 |
| 1823.0 | 1.497 |
| 1824.0 | 1.497 |
| 1825.0 | 1.497 |
| 1826.0 | 1.497 |
| 1827.0 | 1.497 |
| 1828.0 | 1.497 |
| 1829.0 | 1.497 |
| 1830.0 | 1.497 |
| 1831.0 | 1.497 |
| 1832.0 | 1.497 |
| 1833.0 | 1.497 |
| 1834.0 | 1.497 |
| 1835.0 | 1.497 |
| 1836.0 | 1.497 |
| 1837.0 | 1.497 |
| 1838.0 | 1.497 |
| 1839.0 | 1.497 |
| 1840.0 | 1.497 |
| 1841.0 | 1.497 |
| 1842.0 | 1.497 |
| 1843.0 | 1.497 |
| 1844.0 | 1.497 |
| 1845.0 | 1.497 |
| 1846.0 | 1.497 |
| 1847.0 | 1.497 |
| 1848.0 | 1.497 |
| 1849.0 | 1.497 |
| 1850.0 | 1.497 |
| 1851.0 | 1.497 |
| 1852.0 | 1.497 |
| 1853.0 | 1.497 |
| 1854.0 | 1.497 |
| 1855.0 | 1.497 |
| 1856.0 | 1.497 |
| 1857.0 | 1.497 |
| 1858.0 | 1.497 |
| 1859.0 | 1.497 |
| 1860.0 | 1.497 |
| 1861.0 | 1.497 |
| 1862.0 | 1.497 |
| 1863.0 | 1.496 |
| 1864.0 | 1.496 |
| 1865.0 | 1.496 |
| 1866.0 | 1.496 |
| 1867.0 | 1.496 |
| 1868.0 | 1.496 |
| 1869.0 | 1.496 |
| 1870.0 | 1.496 |
| 1871.0 | 1.496 |
| 1872.0 | 1.496 |
| 1873.0 | 1.496 |
| 1874.0 | 1.496 |
| 1875.0 | 1.496 |
| 1876.0 | 1.496 |
| 1877.0 | 1.496 |
| 1878.0 | 1.496 |
| 1879.0 | 1.496 |
| 1880.0 | 1.496 |
| 1881.0 | 1.496 |
| 1882.0 | 1.496 |
| 1883.0 | 1.496 |
| 1884.0 | 1.496 |
| 1885.0 | 1.496 |
| 1886.0 | 1.496 |
| 1887.0 | 1.496 |
| 1888.0 | 1.496 |
| 1889.0 | 1.496 |
| 1890.0 | 1.496 |
| 1891.0 | 1.496 |
| 1892.0 | 1.496 |
| 1893.0 | 1.496 |
| 1894.0 | 1.496 |
| 1895.0 | 1.496 |
| 1896.0 | 1.496 |
| 1897.0 | 1.496 |
| 1898.0 | 1.496 |
| 1899.0 | 1.496 |
| 1900.0 | 1.496 |
| 1901.0 | 1.496 |
| 1902.0 | 1.496 |
| 1903.0 | 1.496 |
| 1904.0 | 1.496 |
| 1905.0 | 1.496 |
| 1906.0 | 1.496 |
| 1907.0 | 1.496 |
| 1908.0 | 1.496 |
| 1909.0 | 1.496 |
| 1910.0 | 1.496 |
| 1911.0 | 1.496 |
| 1912.0 | 1.496 |
| 1913.0 | 1.496 |
| 1914.0 | 1.496 |
| 1915.0 | 1.496 |
| 1916.0 | 1.496 |
| 1917.0 | 1.496 |
| 1918.0 | 1.496 |
| 1919.0 | 1.496 |
| 1920.0 | 1.496 |
| 1921.0 | 1.496 |
| 1922.0 | 1.496 |
| 1923.0 | 1.496 |
| 1924.0 | 1.496 |
| 1925.0 | 1.496 |
| 1926.0 | 1.496 |
| 1927.0 | 1.496 |
| 1928.0 | 1.496 |
| 1929.0 | 1.496 |
| 1930.0 | 1.496 |
| 1931.0 | 1.496 |
| 1932.0 | 1.496 |
| 1933.0 | 1.495 |
| 1934.0 | 1.495 |
| 1935.0 | 1.495 |
| 1936.0 | 1.495 |
| 1937.0 | 1.495 |
| 1938.0 | 1.495 |
| 1939.0 | 1.495 |
| 1940.0 | 1.495 |
| 1941.0 | 1.495 |
| 1942.0 | 1.495 |
| 1943.0 | 1.495 |
| 1944.0 | 1.495 |
| 1945.0 | 1.495 |
| 1946.0 | 1.495 |
| 1947.0 | 1.495 |
| 1948.0 | 1.495 |
| 1949.0 | 1.495 |
| 1950.0 | 1.495 |
| 1951.0 | 1.495 |
| 1952.0 | 1.495 |
| 1953.0 | 1.495 |
| 1954.0 | 1.495 |
| 1955.0 | 1.495 |
| 1956.0 | 1.495 |
| 1957.0 | 1.495 |
| 1958.0 | 1.495 |
| 1959.0 | 1.495 |
| 1960.0 | 1.495 |
| 1961.0 | 1.495 |
| 1962.0 | 1.495 |
| 1963.0 | 1.495 |
| 1964.0 | 1.495 |
| 1965.0 | 1.495 |
| 1966.0 | 1.495 |
| 1967.0 | 1.495 |
| 1968.0 | 1.495 |
| 1969.0 | 1.495 |
| 1970.0 | 1.495 |
| 1971.0 | 1.495 |
| 1972.0 | 1.495 |
| 1973.0 | 1.495 |
| 1974.0 | 1.495 |
| 1975.0 | 1.495 |
| 1976.0 | 1.495 |
| 1977.0 | 1.495 |
| 1978.0 | 1.495 |
| 1979.0 | 1.495 |
| 1980.0 | 1.495 |
| 1981.0 | 1.495 |
| 1982.0 | 1.495 |
| 1983.0 | 1.495 |
| 1984.0 | 1.495 |
| 1985.0 | 1.495 |
| 1986.0 | 1.495 |
| 1987.0 | 1.495 |
| 1988.0 | 1.495 |
| 1989.0 | 1.495 |
| 1990.0 | 1.495 |
| 1991.0 | 1.495 |
| 1992.0 | 1.495 |
| 1993.0 | 1.495 |
| 1994.0 | 1.495 |
| 1995.0 | 1.495 |
| 1996.0 | 1.495 |
| 1997.0 | 1.495 |
| 1998.0 | 1.495 |
| 1999.0 | 1.495 |
| 2000.0 | 1.495 |
| 2001.0 | 1.494 |
| 2002.0 | 1.494 |
| 2003.0 | 1.494 |
| 2004.0 | 1.494 |
| 2005.0 | 1.494 |
| 2006.0 | 1.494 |
| 2007.0 | 1.494 |
| 2008.0 | 1.494 |
| 2009.0 | 1.494 |
| 2010.0 | 1.494 |
| 2011.0 | 1.494 |
| 2012.0 | 1.494 |
| 2013.0 | 1.494 |
| 2014.0 | 1.494 |
| 2015.0 | 1.494 |
| 2016.0 | 1.494 |
| 2017.0 | 1.494 |
| 2018.0 | 1.494 |
| 2019.0 | 1.494 |
| 2020.0 | 1.494 |
| 2021.0 | 1.494 |
| 2022.0 | 1.494 |
| 2023.0 | 1.494 |
| 2024.0 | 1.494 |
| 2025.0 | 1.494 |
| 2026.0 | 1.494 |
| 2027.0 | 1.494 |
| 2028.0 | 1.494 |
| 2029.0 | 1.494 |
| 2030.0 | 1.494 |
| 2031.0 | 1.494 |
| 2032.0 | 1.494 |
| 2033.0 | 1.494 |
| 2034.0 | 1.494 |
| 2035.0 | 1.494 |
| 2036.0 | 1.494 |
| 2037.0 | 1.494 |
| 2038.0 | 1.494 |
| 2039.0 | 1.494 |
| 2040.0 | 1.494 |
| 2041.0 | 1.494 |
| 2042.0 | 1.494 |
| 2043.0 | 1.494 |
| 2044.0 | 1.494 |
| 2045.0 | 1.494 |
| 2046.0 | 1.494 |
| 2047.0 | 1.494 |
| 2048.0 | 1.494 |
| 2049.0 | 1.494 |
| 2050.0 | 1.494 |
| 2051.0 | 1.494 |
| 2052.0 | 1.494 |
| 2053.0 | 1.494 |
| 2054.0 | 1.494 |
| 2055.0 | 1.494 |
| 2056.0 | 1.494 |
| 2057.0 | 1.494 |
| 2058.0 | 1.494 |
| 2059.0 | 1.494 |
| 2060.0 | 1.494 |
| 2061.0 | 1.494 |
| 2062.0 | 1.494 |
| 2063.0 | 1.494 |
| 2064.0 | 1.494 |
| 2065.0 | 1.494 |
| 2066.0 | 1.493 |
| 2067.0 | 1.493 |
| 2068.0 | 1.493 |
| 2069.0 | 1.493 |
| 2070.0 | 1.493 |
| 2071.0 | 1.493 |
| 2072.0 | 1.493 |
| 2073.0 | 1.493 |
| 2074.0 | 1.493 |
| 2075.0 | 1.493 |
| 2076.0 | 1.493 |
| 2077.0 | 1.493 |
| 2078.0 | 1.493 |
| 2079.0 | 1.493 |
| 2080.0 | 1.493 |
| 2081.0 | 1.493 |
| 2082.0 | 1.493 |
| 2083.0 | 1.493 |
| 2084.0 | 1.493 |
| 2085.0 | 1.493 |
| 2086.0 | 1.493 |
| 2087.0 | 1.493 |
| 2088.0 | 1.493 |
| 2089.0 | 1.493 |
| 2090.0 | 1.493 |
| 2091.0 | 1.493 |
| 2092.0 | 1.493 |
| 2093.0 | 1.493 |
| 2094.0 | 1.493 |
| 2095.0 | 1.493 |
| 2096.0 | 1.493 |
| 2097.0 | 1.493 |
| 2098.0 | 1.493 |
| 2099.0 | 1.493 |
| 2100.0 | 1.493 |
| 2101.0 | 1.493 |
| 2102.0 | 1.493 |
| 2103.0 | 1.493 |
| 2104.0 | 1.493 |
| 2105.0 | 1.493 |
| 2106.0 | 1.493 |
| 2107.0 | 1.493 |
| 2108.0 | 1.493 |
| 2109.0 | 1.493 |
| 2110.0 | 1.493 |
| 2111.0 | 1.493 |
| 2112.0 | 1.493 |
| 2113.0 | 1.493 |
| 2114.0 | 1.493 |
| 2115.0 | 1.493 |
| 2116.0 | 1.493 |
| 2117.0 | 1.493 |
| 2118.0 | 1.493 |
| 2119.0 | 1.493 |
| 2120.0 | 1.493 |
| 2121.0 | 1.493 |
| 2122.0 | 1.493 |
| 2123.0 | 1.493 |
| 2124.0 | 1.493 |
| 2125.0 | 1.493 |
| 2126.0 | 1.493 |
| 2127.0 | 1.493 |
| 2128.0 | 1.493 |
| 2129.0 | 1.493 |
| 2130.0 | 1.492 |
| 2131.0 | 1.492 |
| 2132.0 | 1.492 |
| 2133.0 | 1.492 |
| 2134.0 | 1.492 |
| 2135.0 | 1.492 |
| 2136.0 | 1.492 |
| 2137.0 | 1.492 |
| 2138.0 | 1.492 |
| 2139.0 | 1.492 |
| 2140.0 | 1.492 |
| 2141.0 | 1.492 |
| 2142.0 | 1.492 |
| 2143.0 | 1.492 |
| 2144.0 | 1.492 |
| 2145.0 | 1.492 |
| 2146.0 | 1.492 |
| 2147.0 | 1.492 |
| 2148.0 | 1.492 |
| 2149.0 | 1.492 |
| 2150.0 | 1.492 |
| 2151.0 | 1.492 |
| 2152.0 | 1.492 |
| 2153.0 | 1.492 |
| 2154.0 | 1.492 |
| 2155.0 | 1.492 |
| 2156.0 | 1.492 |
| 2157.0 | 1.492 |
| 2158.0 | 1.492 |
| 2159.0 | 1.492 |
| 2160.0 | 1.492 |
| 2161.0 | 1.492 |
| 2162.0 | 1.492 |
| 2163.0 | 1.492 |
| 2164.0 | 1.492 |
| 2165.0 | 1.492 |
| 2166.0 | 1.492 |
| 2167.0 | 1.492 |
| 2168.0 | 1.492 |
| 2169.0 | 1.492 |
| 2170.0 | 1.492 |
| 2171.0 | 1.492 |
| 2172.0 | 1.492 |
| 2173.0 | 1.492 |
| 2174.0 | 1.492 |
| 2175.0 | 1.492 |
| 2176.0 | 1.492 |
| 2177.0 | 1.492 |
| 2178.0 | 1.492 |
| 2179.0 | 1.492 |
| 2180.0 | 1.492 |
| 2181.0 | 1.492 |
| 2182.0 | 1.492 |
| 2183.0 | 1.492 |
| 2184.0 | 1.492 |
| 2185.0 | 1.492 |
| 2186.0 | 1.492 |
| 2187.0 | 1.492 |
| 2188.0 | 1.492 |
| 2189.0 | 1.492 |
| 2190.0 | 1.492 |
| 2191.0 | 1.491 |
| 2192.0 | 1.491 |
| 2193.0 | 1.491 |
| 2194.0 | 1.491 |
| 2195.0 | 1.491 |
| 2196.0 | 1.491 |
| 2197.0 | 1.491 |
| 2198.0 | 1.491 |
| 2199.0 | 1.491 |
| 2200.0 | 1.491 |
| 2201.0 | 1.491 |
| 2202.0 | 1.491 |
| 2203.0 | 1.491 |
| 2204.0 | 1.491 |
| 2205.0 | 1.491 |
| 2206.0 | 1.491 |
| 2207.0 | 1.491 |
| 2208.0 | 1.491 |
| 2209.0 | 1.491 |
| 2210.0 | 1.491 |
| 2211.0 | 1.491 |
| 2212.0 | 1.491 |
| 2213.0 | 1.491 |
| 2214.0 | 1.491 |
| 2215.0 | 1.491 |
| 2216.0 | 1.491 |
| 2217.0 | 1.491 |
| 2218.0 | 1.491 |
| 2219.0 | 1.491 |
| 2220.0 | 1.491 |
| 2221.0 | 1.491 |
| 2222.0 | 1.491 |
| 2223.0 | 1.491 |
| 2224.0 | 1.491 |
| 2225.0 | 1.491 |
| 2226.0 | 1.491 |
| 2227.0 | 1.491 |
| 2228.0 | 1.491 |
| 2229.0 | 1.491 |
| 2230.0 | 1.491 |
| 2231.0 | 1.491 |
| 2232.0 | 1.491 |
| 2233.0 | 1.491 |
| 2234.0 | 1.491 |
| 2235.0 | 1.491 |
| 2236.0 | 1.491 |
| 2237.0 | 1.491 |
| 2238.0 | 1.491 |
| 2239.0 | 1.491 |
| 2240.0 | 1.491 |
| 2241.0 | 1.491 |
| 2242.0 | 1.491 |
| 2243.0 | 1.491 |
| 2244.0 | 1.491 |
| 2245.0 | 1.491 |
| 2246.0 | 1.491 |
| 2247.0 | 1.491 |
| 2248.0 | 1.491 |
| 2249.0 | 1.491 |
| 2250.0 | 1.491 |
| 2251.0 | 1.49 |
| 2252.0 | 1.49 |
| 2253.0 | 1.49 |
| 2254.0 | 1.49 |
| 2255.0 | 1.49 |
| 2256.0 | 1.49 |
| 2257.0 | 1.49 |
| 2258.0 | 1.49 |
| 2259.0 | 1.49 |
| 2260.0 | 1.49 |
| 2261.0 | 1.49 |
| 2262.0 | 1.49 |
| 2263.0 | 1.49 |
| 2264.0 | 1.49 |
| 2265.0 | 1.49 |
| 2266.0 | 1.49 |
| 2267.0 | 1.49 |
| 2268.0 | 1.49 |
| 2269.0 | 1.49 |
| 2270.0 | 1.49 |
| 2271.0 | 1.49 |
| 2272.0 | 1.49 |
| 2273.0 | 1.49 |
| 2274.0 | 1.49 |
| 2275.0 | 1.49 |
| 2276.0 | 1.49 |
| 2277.0 | 1.49 |
| 2278.0 | 1.49 |
| 2279.0 | 1.49 |
| 2280.0 | 1.49 |
| 2281.0 | 1.49 |
| 2282.0 | 1.49 |
| 2283.0 | 1.49 |
| 2284.0 | 1.49 |
| 2285.0 | 1.49 |
| 2286.0 | 1.49 |
| 2287.0 | 1.49 |
| 2288.0 | 1.49 |
| 2289.0 | 1.49 |
| 2290.0 | 1.49 |
| 2291.0 | 1.49 |
| 2292.0 | 1.49 |
| 2293.0 | 1.49 |
| 2294.0 | 1.49 |
| 2295.0 | 1.49 |
| 2296.0 | 1.49 |
| 2297.0 | 1.49 |
| 2298.0 | 1.49 |
| 2299.0 | 1.49 |
| 2300.0 | 1.49 |
| 2301.0 | 1.49 |
| 2302.0 | 1.49 |
| 2303.0 | 1.49 |
| 2304.0 | 1.49 |
| 2305.0 | 1.49 |
| 2306.0 | 1.49 |
| 2307.0 | 1.49 |
| 2308.0 | 1.49 |
| 2309.0 | 1.489 |
| 2310.0 | 1.489 |
| 2311.0 | 1.489 |
| 2312.0 | 1.489 |
| 2313.0 | 1.489 |
| 2314.0 | 1.489 |
| 2315.0 | 1.489 |
| 2316.0 | 1.489 |
| 2317.0 | 1.489 |
| 2318.0 | 1.489 |
| 2319.0 | 1.489 |
| 2320.0 | 1.489 |
| 2321.0 | 1.489 |
| 2322.0 | 1.489 |
| 2323.0 | 1.489 |
| 2324.0 | 1.489 |
| 2325.0 | 1.489 |
| 2326.0 | 1.489 |
| 2327.0 | 1.489 |
| 2328.0 | 1.489 |
| 2329.0 | 1.489 |
| 2330.0 | 1.489 |
| 2331.0 | 1.489 |
| 2332.0 | 1.489 |
| 2333.0 | 1.489 |
| 2334.0 | 1.489 |
| 2335.0 | 1.489 |
| 2336.0 | 1.489 |
| 2337.0 | 1.489 |
| 2338.0 | 1.489 |
| 2339.0 | 1.489 |
| 2340.0 | 1.489 |
| 2341.0 | 1.489 |
| 2342.0 | 1.489 |
| 2343.0 | 1.489 |
| 2344.0 | 1.489 |
| 2345.0 | 1.489 |
| 2346.0 | 1.489 |
| 2347.0 | 1.489 |
| 2348.0 | 1.489 |
| 2349.0 | 1.489 |
| 2350.0 | 1.489 |
| 2351.0 | 1.489 |
| 2352.0 | 1.489 |
| 2353.0 | 1.489 |
| 2354.0 | 1.489 |
| 2355.0 | 1.489 |
| 2356.0 | 1.489 |
| 2357.0 | 1.489 |
| 2358.0 | 1.489 |
| 2359.0 | 1.489 |
| 2360.0 | 1.489 |
| 2361.0 | 1.489 |
| 2362.0 | 1.489 |
| 2363.0 | 1.489 |
| 2364.0 | 1.489 |
| 2365.0 | 1.489 |
| 2366.0 | 1.488 |
| 2367.0 | 1.488 |
| 2368.0 | 1.488 |
| 2369.0 | 1.488 |
| 2370.0 | 1.488 |
| 2371.0 | 1.488 |
| 2372.0 | 1.488 |
| 2373.0 | 1.488 |
| 2374.0 | 1.488 |
| 2375.0 | 1.488 |
| 2376.0 | 1.488 |
| 2377.0 | 1.488 |
| 2378.0 | 1.488 |
| 2379.0 | 1.488 |
| 2380.0 | 1.488 |
| 2381.0 | 1.488 |
| 2382.0 | 1.488 |
| 2383.0 | 1.488 |
| 2384.0 | 1.488 |
| 2385.0 | 1.488 |
| 2386.0 | 1.488 |
| 2387.0 | 1.488 |
| 2388.0 | 1.488 |
| 2389.0 | 1.488 |
| 2390.0 | 1.488 |
| 2391.0 | 1.488 |
| 2392.0 | 1.488 |
| 2393.0 | 1.488 |
| 2394.0 | 1.488 |
| 2395.0 | 1.488 |
| 2396.0 | 1.488 |
| 2397.0 | 1.488 |
| 2398.0 | 1.488 |
| 2399.0 | 1.488 |
| 2400.0 | 1.488 |
| 2401.0 | 1.488 |
| 2402.0 | 1.488 |
| 2403.0 | 1.488 |
| 2404.0 | 1.488 |
| 2405.0 | 1.488 |
| 2406.0 | 1.488 |
| 2407.0 | 1.488 |
| 2408.0 | 1.488 |
| 2409.0 | 1.488 |
| 2410.0 | 1.488 |
| 2411.0 | 1.488 |
| 2412.0 | 1.488 |
| 2413.0 | 1.488 |
| 2414.0 | 1.488 |
| 2415.0 | 1.488 |
| 2416.0 | 1.488 |
| 2417.0 | 1.488 |
| 2418.0 | 1.488 |
| 2419.0 | 1.488 |
| 2420.0 | 1.488 |
| 2421.0 | 1.487 |
| 2422.0 | 1.487 |
| 2423.0 | 1.487 |
| 2424.0 | 1.487 |
| 2425.0 | 1.487 |
| 2426.0 | 1.487 |
| 2427.0 | 1.487 |
| 2428.0 | 1.487 |
| 2429.0 | 1.487 |
| 2430.0 | 1.487 |
| 2431.0 | 1.487 |
| 2432.0 | 1.487 |
| 2433.0 | 1.487 |
| 2434.0 | 1.487 |
| 2435.0 | 1.487 |
| 2436.0 | 1.487 |
| 2437.0 | 1.487 |
| 2438.0 | 1.487 |
| 2439.0 | 1.487 |
| 2440.0 | 1.487 |
| 2441.0 | 1.487 |
| 2442.0 | 1.487 |
| 2443.0 | 1.487 |
| 2444.0 | 1.487 |
| 2445.0 | 1.487 |
| 2446.0 | 1.487 |
| 2447.0 | 1.487 |
| 2448.0 | 1.487 |
| 2449.0 | 1.487 |
| 2450.0 | 1.487 |
| 2451.0 | 1.487 |
| 2452.0 | 1.487 |
| 2453.0 | 1.487 |
| 2454.0 | 1.487 |
| 2455.0 | 1.487 |
| 2456.0 | 1.487 |
| 2457.0 | 1.487 |
| 2458.0 | 1.487 |
| 2459.0 | 1.487 |
| 2460.0 | 1.487 |
| 2461.0 | 1.487 |
| 2462.0 | 1.487 |
| 2463.0 | 1.487 |
| 2464.0 | 1.487 |
| 2465.0 | 1.487 |
| 2466.0 | 1.487 |
| 2467.0 | 1.487 |
| 2468.0 | 1.487 |
| 2469.0 | 1.487 |
| 2470.0 | 1.487 |
| 2471.0 | 1.487 |
| 2472.0 | 1.487 |
| 2473.0 | 1.487 |
| 2474.0 | 1.487 |
| 2475.0 | 1.486 |
| 2476.0 | 1.486 |
| 2477.0 | 1.486 |
| 2478.0 | 1.486 |
| 2479.0 | 1.486 |
| 2480.0 | 1.486 |
| 2481.0 | 1.486 |
| 2482.0 | 1.486 |
| 2483.0 | 1.486 |
| 2484.0 | 1.486 |
| 2485.0 | 1.486 |
| 2486.0 | 1.486 |
| 2487.0 | 1.486 |
| 2488.0 | 1.486 |
| 2489.0 | 1.486 |
| 2490.0 | 1.486 |
| 2491.0 | 1.486 |
| 2492.0 | 1.486 |
| 2493.0 | 1.486 |
| 2494.0 | 1.486 |
| 2495.0 | 1.486 |
| 2496.0 | 1.486 |
| 2497.0 | 1.486 |
| 2498.0 | 1.486 |
| 2499.0 | 1.486 |
| 2500.0 | 1.486 |
| 2501.0 | 1.486 |
| 2502.0 | 1.486 |
| 2503.0 | 1.486 |
| 2504.0 | 1.486 |
| 2505.0 | 1.486 |
| 2506.0 | 1.486 |
| 2507.0 | 1.486 |
| 2508.0 | 1.486 |
| 2509.0 | 1.486 |
| 2510.0 | 1.486 |
| 2511.0 | 1.486 |
| 2512.0 | 1.486 |
| 2513.0 | 1.486 |
| 2514.0 | 1.486 |
| 2515.0 | 1.486 |
| 2516.0 | 1.486 |
| 2517.0 | 1.486 |
| 2518.0 | 1.486 |
| 2519.0 | 1.486 |
| 2520.0 | 1.486 |
| 2521.0 | 1.486 |
| 2522.0 | 1.486 |
| 2523.0 | 1.486 |
| 2524.0 | 1.486 |
| 2525.0 | 1.486 |
| 2526.0 | 1.486 |
| 2527.0 | 1.485 |
| 2528.0 | 1.485 |
| 2529.0 | 1.485 |
| 2530.0 | 1.485 |
| 2531.0 | 1.485 |
| 2532.0 | 1.485 |
| 2533.0 | 1.485 |
| 2534.0 | 1.485 |
| 2535.0 | 1.485 |
| 2536.0 | 1.485 |
| 2537.0 | 1.485 |
| 2538.0 | 1.485 |
| 2539.0 | 1.485 |
| 2540.0 | 1.485 |
| 2541.0 | 1.485 |
| 2542.0 | 1.485 |
| 2543.0 | 1.485 |
| 2544.0 | 1.485 |
| 2545.0 | 1.485 |
| 2546.0 | 1.485 |
| 2547.0 | 1.485 |
| 2548.0 | 1.485 |
| 2549.0 | 1.485 |
| 2550.0 | 1.485 |
| 2551.0 | 1.485 |
| 2552.0 | 1.485 |
| 2553.0 | 1.485 |
| 2554.0 | 1.485 |
| 2555.0 | 1.485 |
| 2556.0 | 1.485 |
| 2557.0 | 1.485 |
| 2558.0 | 1.485 |
| 2559.0 | 1.485 |
| 2560.0 | 1.485 |
| 2561.0 | 1.485 |
| 2562.0 | 1.485 |
| 2563.0 | 1.485 |
| 2564.0 | 1.485 |
| 2565.0 | 1.485 |
| 2566.0 | 1.485 |
| 2567.0 | 1.485 |
| 2568.0 | 1.485 |
| 2569.0 | 1.485 |
| 2570.0 | 1.485 |
| 2571.0 | 1.485 |
| 2572.0 | 1.485 |
| 2573.0 | 1.485 |
| 2574.0 | 1.485 |
| 2575.0 | 1.485 |
| 2576.0 | 1.485 |
| 2577.0 | 1.485 |
| 2578.0 | 1.485 |
| 2579.0 | 1.484 |
| 2580.0 | 1.484 |
| 2581.0 | 1.484 |
| 2582.0 | 1.484 |
| 2583.0 | 1.484 |
| 2584.0 | 1.484 |
| 2585.0 | 1.484 |
| 2586.0 | 1.484 |
| 2587.0 | 1.484 |
| 2588.0 | 1.484 |
| 2589.0 | 1.484 |
| 2590.0 | 1.484 |
| 2591.0 | 1.484 |
| 2592.0 | 1.484 |
| 2593.0 | 1.484 |
| 2594.0 | 1.484 |
| 2595.0 | 1.484 |
| 2596.0 | 1.484 |
| 2597.0 | 1.484 |
| 2598.0 | 1.484 |
| 2599.0 | 1.484 |
| 2600.0 | 1.484 |